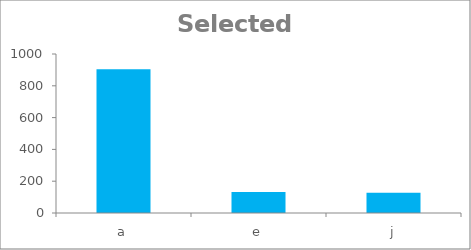
| Category | Selected Data |
|---|---|
| a | 904.228 |
| e | 131.759 |
| j | 127.552 |